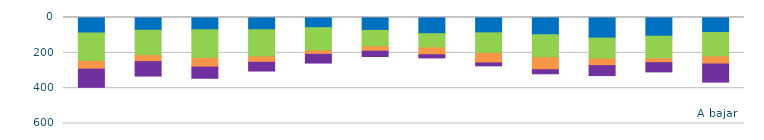
| Category | Regulación secundaria | Regulación terciaria | Gestión de desvíos | Restricciones TReal |
|---|---|---|---|---|
| 0 | 87.594 | 159.999 | 44.561 | 103.104 |
| 1 | 72.172 | 143.598 | 34.229 | 81.608 |
| 2 | 69.478 | 162.378 | 48.704 | 63.428 |
| 3 | 69.238 | 154.094 | 30.144 | 49.473 |
| 4 | 57.736 | 130.584 | 20.354 | 49.266 |
| 5 | 73.081 | 92.087 | 25.604 | 29.937 |
| 6 | 91.861 | 80.437 | 38.762 | 17.66 |
| 7 | 86.754 | 116.61 | 53.683 | 16.718 |
| 8 | 97.6 | 129.547 | 68.59 | 22.759 |
| 9 | 116.44 | 118.509 | 37.595 | 56.227 |
| 10 | 105.778 | 127.074 | 22.708 | 52.383 |
| 11 | 84.595 | 138.424 | 40.16 | 102.61 |